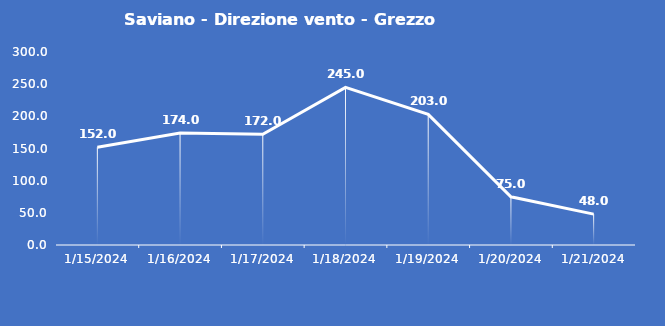
| Category | Saviano - Direzione vento - Grezzo (°N) |
|---|---|
| 1/15/24 | 152 |
| 1/16/24 | 174 |
| 1/17/24 | 172 |
| 1/18/24 | 245 |
| 1/19/24 | 203 |
| 1/20/24 | 75 |
| 1/21/24 | 48 |